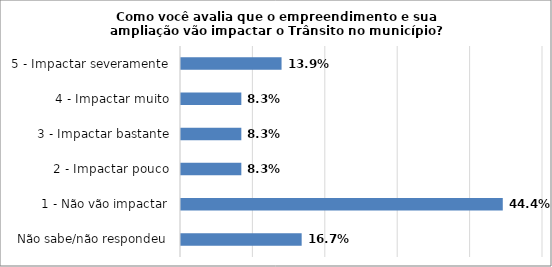
| Category | Series 0 |
|---|---|
| Não sabe/não respondeu | 0.167 |
| 1 - Não vão impactar | 0.444 |
| 2 - Impactar pouco | 0.083 |
| 3 - Impactar bastante | 0.083 |
| 4 - Impactar muito | 0.083 |
| 5 - Impactar severamente | 0.139 |